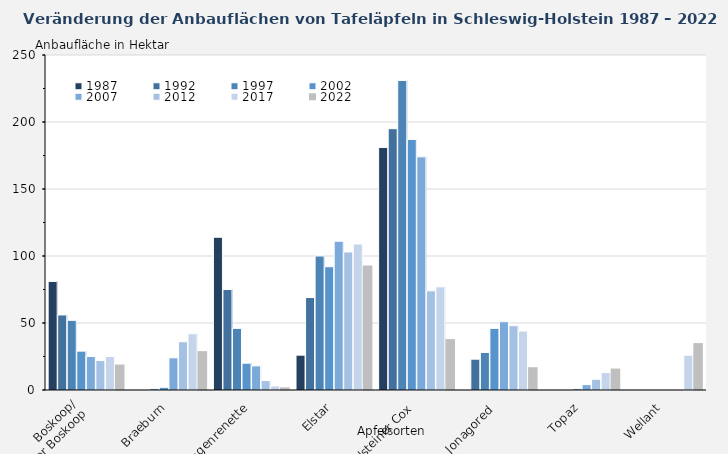
| Category | 1987 | 1992 | 1997 | 2002 | 2007 | 2012 | 2017 | 2022 |
|---|---|---|---|---|---|---|---|---|
| Boskoop/
  Roter Boskoop | 81 | 56 | 52 | 29 | 25 | 22 | 25 | 19 |
| Braeburn | 0 | 0 | 1 | 2 | 24 | 36 | 42 | 29 |
| Cox Orangenrenette | 114 | 75 | 46 | 20 | 18 | 7 | 3 | 2 |
| Elstar | 26 | 69 | 100 | 92 | 111 | 103 | 109 | 93 |
| Holsteiner Cox | 181 | 195 | 231 | 187 | 174 | 74 | 77 | 38 |
| Jonagored  | 0 | 23 | 28 | 46 | 51 | 48 | 44 | 17 |
| Topaz | 0 | 0 | 0 | 1 | 4 | 8 | 13 | 16 |
| Wellant | 0 | 0 | 0 | 0 | 0 | 0 | 26 | 35 |